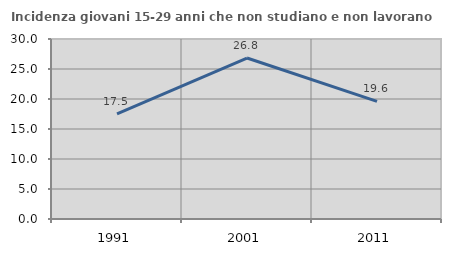
| Category | Incidenza giovani 15-29 anni che non studiano e non lavorano  |
|---|---|
| 1991.0 | 17.52 |
| 2001.0 | 26.833 |
| 2011.0 | 19.605 |